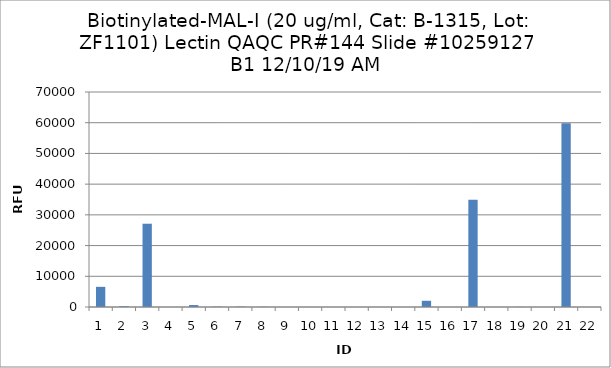
| Category | Series 0 |
|---|---|
| 0 | 6561.5 |
| 1 | 233.75 |
| 2 | 27114.75 |
| 3 | 0 |
| 4 | 637.75 |
| 5 | 104.75 |
| 6 | 124.75 |
| 7 | 57.25 |
| 8 | 3.75 |
| 9 | 11.5 |
| 10 | 8.75 |
| 11 | -25.25 |
| 12 | 18 |
| 13 | 8.5 |
| 14 | 2023.25 |
| 15 | 9.5 |
| 16 | 34904.25 |
| 17 | 13 |
| 18 | 34.25 |
| 19 | 7.75 |
| 20 | 59844.75 |
| 21 | -0.5 |